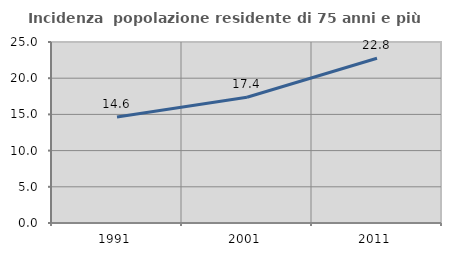
| Category | Incidenza  popolazione residente di 75 anni e più |
|---|---|
| 1991.0 | 14.634 |
| 2001.0 | 17.376 |
| 2011.0 | 22.757 |